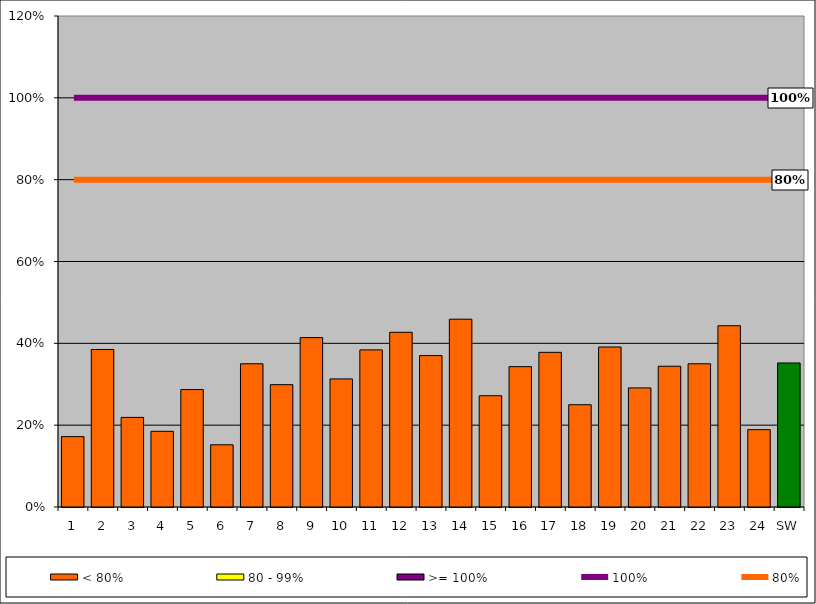
| Category | < 80% | 80 - 99% | >= 100% |
|---|---|---|---|
| 1 | 0.172 | 0 | 0 |
| 2 | 0.385 | 0 | 0 |
| 3 | 0.219 | 0 | 0 |
| 4 | 0.185 | 0 | 0 |
| 5 | 0.287 | 0 | 0 |
| 6 | 0.152 | 0 | 0 |
| 7 | 0.35 | 0 | 0 |
| 8 | 0.299 | 0 | 0 |
| 9 | 0.414 | 0 | 0 |
| 10 | 0.313 | 0 | 0 |
| 11 | 0.384 | 0 | 0 |
| 12 | 0.427 | 0 | 0 |
| 13 | 0.37 | 0 | 0 |
| 14 | 0.459 | 0 | 0 |
| 15 | 0.272 | 0 | 0 |
| 16 | 0.343 | 0 | 0 |
| 17 | 0.378 | 0 | 0 |
| 18 | 0.25 | 0 | 0 |
| 19 | 0.391 | 0 | 0 |
| 20 | 0.291 | 0 | 0 |
| 21 | 0.344 | 0 | 0 |
| 22 | 0.35 | 0 | 0 |
| 23 | 0.443 | 0 | 0 |
| 24 | 0.189 | 0 | 0 |
| SW | 0.352 | 0 | 0 |